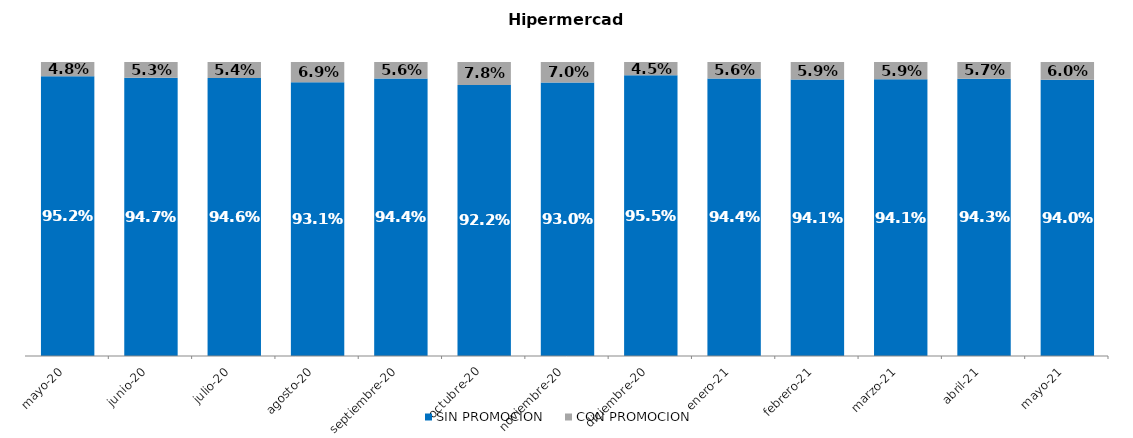
| Category | SIN PROMOCION   | CON PROMOCION   |
|---|---|---|
| 2020-05-01 | 0.952 | 0.048 |
| 2020-06-01 | 0.947 | 0.053 |
| 2020-07-01 | 0.946 | 0.054 |
| 2020-08-01 | 0.931 | 0.069 |
| 2020-09-01 | 0.944 | 0.056 |
| 2020-10-01 | 0.922 | 0.078 |
| 2020-11-01 | 0.93 | 0.07 |
| 2020-12-01 | 0.955 | 0.045 |
| 2021-01-01 | 0.944 | 0.056 |
| 2021-02-01 | 0.941 | 0.059 |
| 2021-03-01 | 0.941 | 0.059 |
| 2021-04-01 | 0.943 | 0.057 |
| 2021-05-01 | 0.94 | 0.06 |